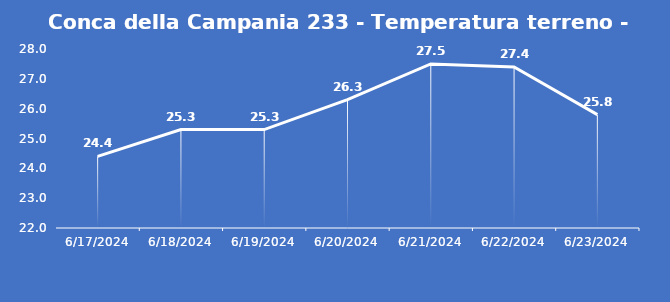
| Category | Conca della Campania 233 - Temperatura terreno - Grezzo (°C) |
|---|---|
| 6/17/24 | 24.4 |
| 6/18/24 | 25.3 |
| 6/19/24 | 25.3 |
| 6/20/24 | 26.3 |
| 6/21/24 | 27.5 |
| 6/22/24 | 27.4 |
| 6/23/24 | 25.8 |